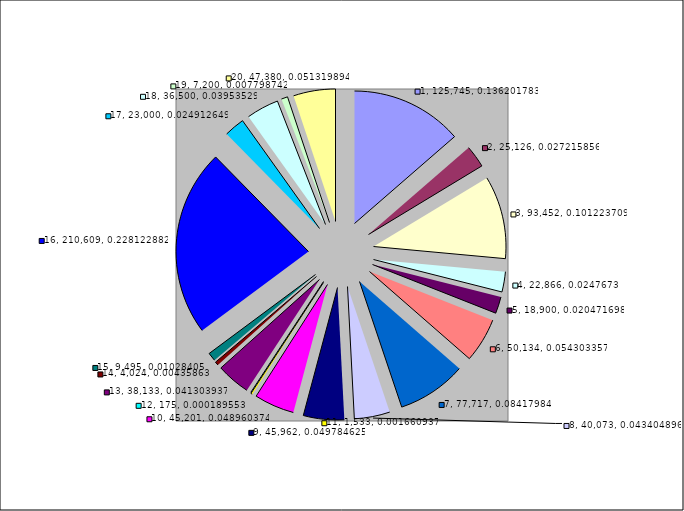
| Category | 1 |
|---|---|
| 0 | 125745 |
| 1 | 25126.38 |
| 2 | 93452.34 |
| 3 | 22865.81 |
| 4 | 18900 |
| 5 | 50134.26 |
| 6 | 77717 |
| 7 | 40072.52 |
| 8 | 45962.45 |
| 9 | 45201.48 |
| 10 | 1533.42 |
| 11 | 175 |
| 12 | 38132.86 |
| 13 | 4024 |
| 14 | 9494.5 |
| 15 | 210608.93 |
| 16 | 23000 |
| 17 | 36500 |
| 18 | 7200 |
| 19 | 47379.85 |